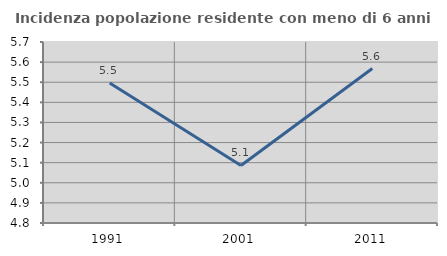
| Category | Incidenza popolazione residente con meno di 6 anni |
|---|---|
| 1991.0 | 5.496 |
| 2001.0 | 5.086 |
| 2011.0 | 5.568 |